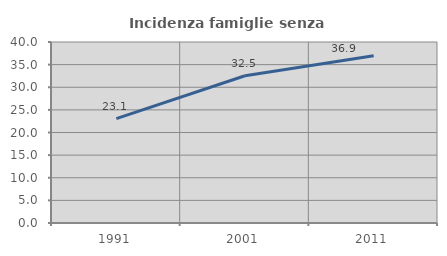
| Category | Incidenza famiglie senza nuclei |
|---|---|
| 1991.0 | 23.073 |
| 2001.0 | 32.541 |
| 2011.0 | 36.95 |